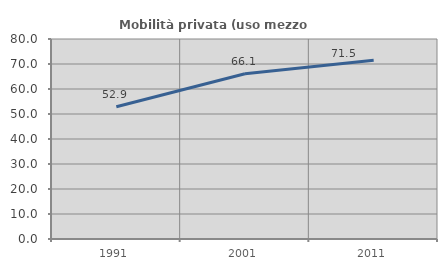
| Category | Mobilità privata (uso mezzo privato) |
|---|---|
| 1991.0 | 52.913 |
| 2001.0 | 66.108 |
| 2011.0 | 71.502 |